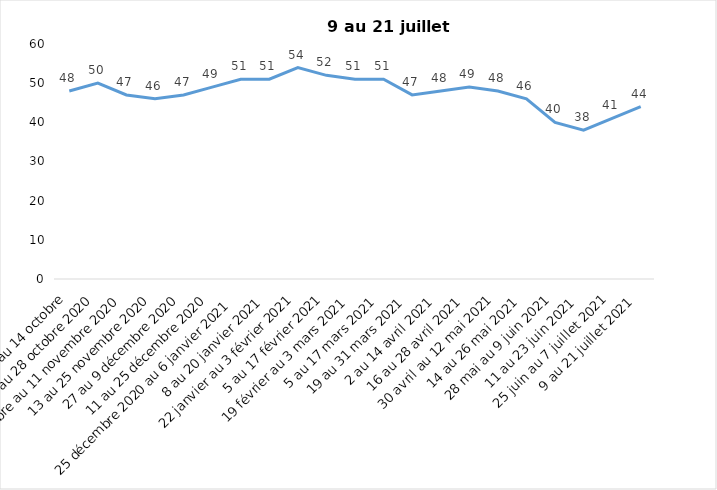
| Category | Toujours aux trois mesures |
|---|---|
| 2 au 14 octobre | 48 |
| 16 au 28 octobre 2020 | 50 |
| 30 octobre au 11 novembre 2020 | 47 |
| 13 au 25 novembre 2020 | 46 |
| 27 au 9 décembre 2020 | 47 |
| 11 au 25 décembre 2020 | 49 |
| 25 décembre 2020 au 6 janvier 2021 | 51 |
| 8 au 20 janvier 2021 | 51 |
| 22 janvier au 3 février 2021 | 54 |
| 5 au 17 février 2021 | 52 |
| 19 février au 3 mars 2021 | 51 |
| 5 au 17 mars 2021 | 51 |
| 19 au 31 mars 2021 | 47 |
| 2 au 14 avril 2021 | 48 |
| 16 au 28 avril 2021 | 49 |
| 30 avril au 12 mai 2021 | 48 |
| 14 au 26 mai 2021 | 46 |
| 28 mai au 9 juin 2021 | 40 |
| 11 au 23 juin 2021 | 38 |
| 25 juin au 7 juillet 2021 | 41 |
| 9 au 21 juillet 2021 | 44 |